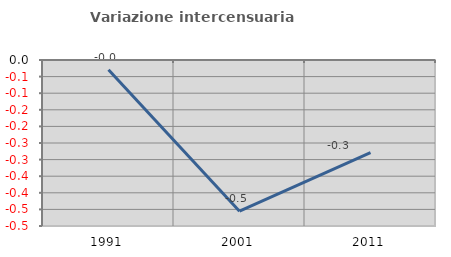
| Category | Variazione intercensuaria annua |
|---|---|
| 1991.0 | -0.029 |
| 2001.0 | -0.455 |
| 2011.0 | -0.279 |